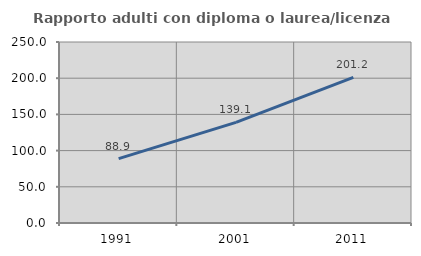
| Category | Rapporto adulti con diploma o laurea/licenza media  |
|---|---|
| 1991.0 | 88.934 |
| 2001.0 | 139.057 |
| 2011.0 | 201.18 |